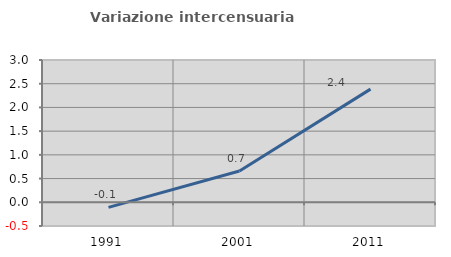
| Category | Variazione intercensuaria annua |
|---|---|
| 1991.0 | -0.107 |
| 2001.0 | 0.66 |
| 2011.0 | 2.386 |